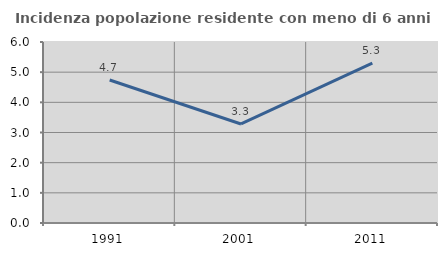
| Category | Incidenza popolazione residente con meno di 6 anni |
|---|---|
| 1991.0 | 4.741 |
| 2001.0 | 3.283 |
| 2011.0 | 5.303 |